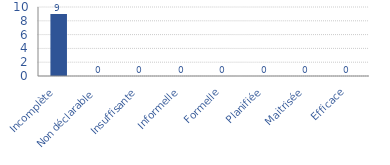
| Category | Tracé de l'Histogramme "Bonnes Pratiques" |
|---|---|
| Incomplète | 9 |
| Non déclarable | 0 |
| Insuffisante | 0 |
| Informelle | 0 |
| Formelle | 0 |
| Planifiée | 0 |
| Maitrisée | 0 |
| Efficace | 0 |